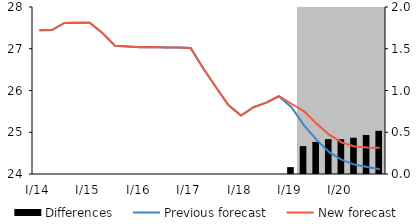
| Category | Differences |
|---|---|
| 0 | 0 |
| 1 | 0 |
| 2 | 0 |
| 3 | 0 |
| 4 | 0 |
| 5 | 0 |
| 6 | 0 |
| 7 | 0 |
| 8 | 0 |
| 9 | 0 |
| 10 | 0 |
| 11 | 0 |
| 12 | 0 |
| 13 | 0 |
| 14 | 0 |
| 15 | 0 |
| 16 | 0 |
| 17 | 0 |
| 18 | 0 |
| 19 | 0 |
| 20 | 0.082 |
| 21 | 0.334 |
| 22 | 0.384 |
| 23 | 0.417 |
| 24 | 0.416 |
| 25 | 0.434 |
| 26 | 0.467 |
| 27 | 0.517 |